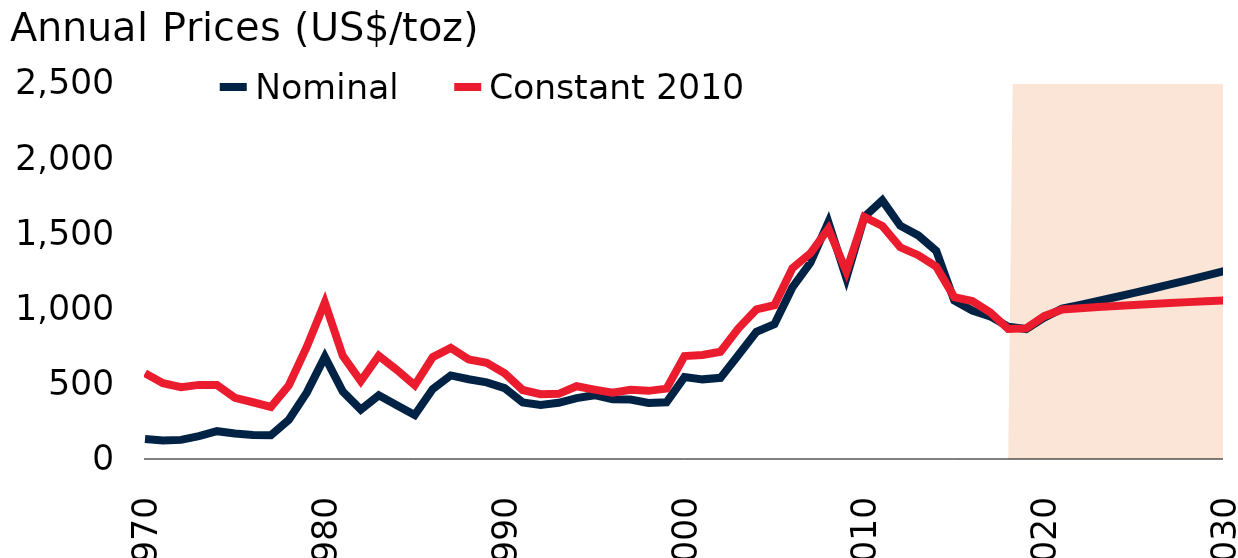
| Category | Nominal | Constant 2010 |
|---|---|---|
| 1970.0 | 132.5 | 570.761 |
| 1971.0 | 123.042 | 503.967 |
| 1972.0 | 127.125 | 477.328 |
| 1973.0 | 152.184 | 492.719 |
| 1974.0 | 184.978 | 491.439 |
| 1975.0 | 169.874 | 406.37 |
| 1976.0 | 159.648 | 377.275 |
| 1977.0 | 158.322 | 346.117 |
| 1978.0 | 260.651 | 490.335 |
| 1979.0 | 442.798 | 746.726 |
| 1980.0 | 679.1 | 1041.175 |
| 1981.0 | 447.482 | 685.283 |
| 1982.0 | 328.292 | 518.187 |
| 1983.0 | 423.308 | 686.364 |
| 1984.0 | 357.808 | 593.217 |
| 1985.0 | 292.499 | 490.05 |
| 1986.0 | 465.04 | 677.4 |
| 1987.0 | 555.723 | 738.697 |
| 1988.0 | 530.343 | 661.993 |
| 1989.0 | 509.642 | 639.988 |
| 1990.0 | 471.589 | 570.432 |
| 1991.0 | 375.817 | 458.805 |
| 1992.0 | 359.686 | 431.055 |
| 1993.0 | 374.026 | 433.288 |
| 1994.0 | 405.262 | 484.011 |
| 1995.0 | 424.337 | 461.637 |
| 1996.0 | 397.112 | 440.411 |
| 1997.0 | 394.915 | 459.62 |
| 1998.0 | 372.278 | 453.054 |
| 1999.0 | 376.949 | 467.729 |
| 2000.0 | 544.631 | 684.557 |
| 2001.0 | 529.529 | 691.5 |
| 2002.0 | 539.514 | 712.862 |
| 2003.0 | 691.714 | 868.792 |
| 2004.0 | 845.35 | 994.224 |
| 2005.0 | 896.528 | 1022.217 |
| 2006.0 | 1140.78 | 1268.574 |
| 2007.0 | 1304.94 | 1367.436 |
| 2008.0 | 1574.499 | 1531.109 |
| 2009.0 | 1203.401 | 1247.537 |
| 2010.0 | 1609.754 | 1609.754 |
| 2011.0 | 1719.482 | 1549.142 |
| 2012.0 | 1550.836 | 1407.609 |
| 2013.0 | 1486.545 | 1355.168 |
| 2014.0 | 1383.571 | 1278.51 |
| 2015.0 | 1053.203 | 1076.257 |
| 2016.0 | 987.087 | 1049.716 |
| 2017.0 | 948.453 | 974.559 |
| 2018.0 | 879.546 | 864.166 |
| 2019.0 | 863.989 | 868.523 |
| 2020.0 | 940 | 949.595 |
| 2021.0 | 1000 | 994.324 |
| 2022.0 | 1025.104 | 1002.487 |
| 2023.0 | 1050.837 | 1010.127 |
| 2024.0 | 1077.217 | 1017.346 |
| 2025.0 | 1104.259 | 1024.207 |
| 2026.0 | 1131.98 | 1030.755 |
| 2027.0 | 1160.397 | 1037.023 |
| 2028.0 | 1189.527 | 1043.03 |
| 2029.0 | 1219.389 | 1048.793 |
| 2030.0 | 1250 | 1054.321 |